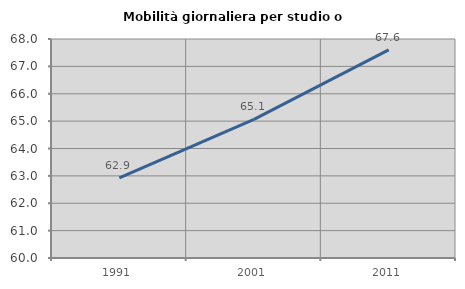
| Category | Mobilità giornaliera per studio o lavoro |
|---|---|
| 1991.0 | 62.926 |
| 2001.0 | 65.065 |
| 2011.0 | 67.604 |